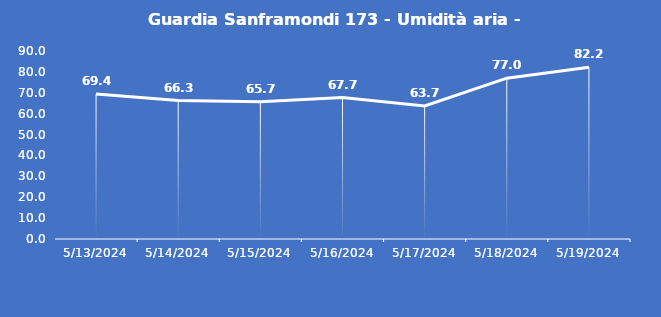
| Category | Guardia Sanframondi 173 - Umidità aria - Grezzo (%) |
|---|---|
| 5/13/24 | 69.4 |
| 5/14/24 | 66.3 |
| 5/15/24 | 65.7 |
| 5/16/24 | 67.7 |
| 5/17/24 | 63.7 |
| 5/18/24 | 77 |
| 5/19/24 | 82.2 |